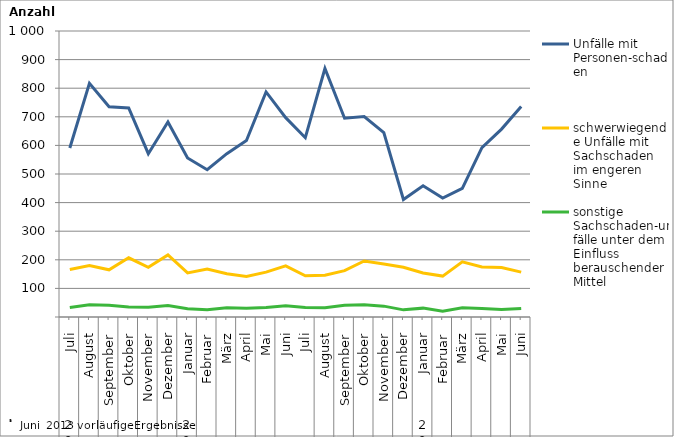
| Category | Unfälle mit Personen-schaden | schwerwiegende Unfälle mit Sachschaden   im engeren Sinne | sonstige Sachschaden-unfälle unter dem Einfluss berauschender Mittel |
|---|---|---|---|
| 0 | 591 | 166 | 33 |
| 1 | 817 | 180 | 43 |
| 2 | 735 | 165 | 41 |
| 3 | 731 | 207 | 35 |
| 4 | 571 | 174 | 34 |
| 5 | 682 | 217 | 40 |
| 6 | 556 | 154 | 29 |
| 7 | 515 | 168 | 25 |
| 8 | 571 | 151 | 32 |
| 9 | 617 | 142 | 31 |
| 10 | 787 | 157 | 33 |
| 11 | 697 | 179 | 39 |
| 12 | 627 | 144 | 33 |
| 13 | 869 | 146 | 32 |
| 14 | 695 | 162 | 41 |
| 15 | 701 | 196 | 43 |
| 16 | 645 | 185 | 38 |
| 17 | 411 | 174 | 25 |
| 18 | 459 | 154 | 31 |
| 19 | 416 | 143 | 20 |
| 20 | 450 | 193 | 32 |
| 21 | 592 | 175 | 30 |
| 22 | 657 | 173 | 26 |
| 23 | 736 | 157 | 30 |